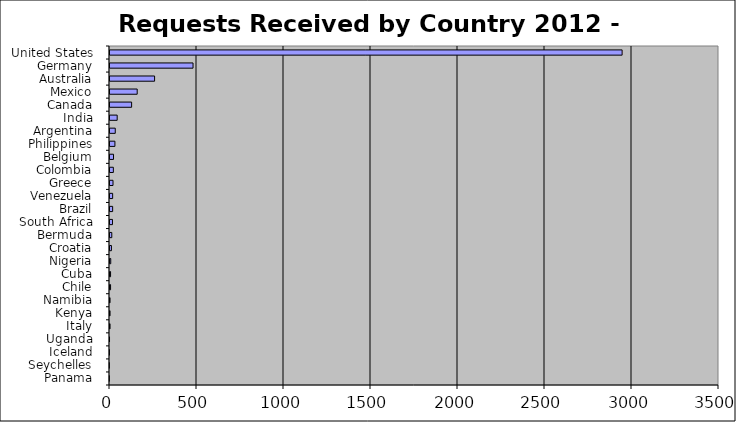
| Category | Series 0 | Series 1 |
|---|---|---|
| Panama  | 1 | 0 |
| Seychelles  | 1 | 0 |
| Iceland  | 2 | 0 |
| Uganda  | 3 | 0.001 |
| Italy  | 6 | 0.001 |
| Kenya  | 6 | 0.001 |
| Namibia  | 6 | 0.001 |
| Chile  | 9 | 0.002 |
| Cuba  | 9 | 0.002 |
| Nigeria  | 10 | 0.002 |
| Croatia  | 14 | 0.003 |
| Bermuda  | 16 | 0.004 |
| South Africa  | 20 | 0.005 |
| Brazil  | 21 | 0.005 |
| Venezuela  | 21 | 0.005 |
| Greece  | 23 | 0.005 |
| Colombia  | 25 | 0.006 |
| Belgium  | 26 | 0.006 |
| Philippines  | 34 | 0.008 |
| Argentina  | 36 | 0.008 |
| India  | 47 | 0.011 |
| Canada  | 130 | 0.03 |
| Mexico  | 162 | 0.037 |
| Australia  | 262 | 0.061 |
| Germany  | 483 | 0.112 |
| United States  | 2949 | 0.682 |